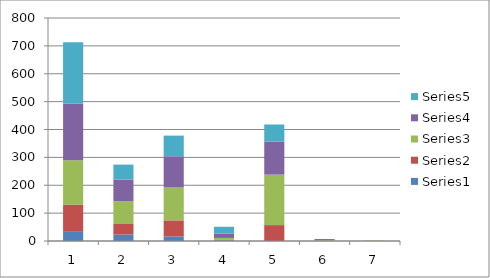
| Category | Series 0 | Series 1 | Series 2 | Series 3 | Series 4 |
|---|---|---|---|---|---|
| 0 | 33 | 98 | 159 | 203 | 220 |
| 1 | 23 | 38 | 82 | 77 | 54 |
| 2 | 16 | 58 | 118 | 112 | 74 |
| 3 | 2 | 2 | 7 | 15 | 25 |
| 4 | 0 | 57 | 181 | 119 | 61 |
| 5 | 0 | 0 | 3 | 4 | 0 |
| 6 | 0 | 0 | 2 | 0 | 0 |